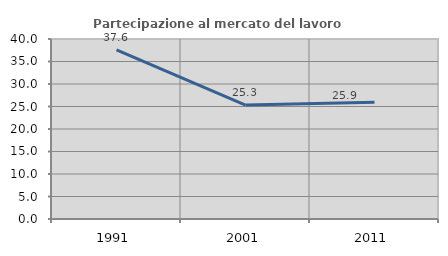
| Category | Partecipazione al mercato del lavoro  femminile |
|---|---|
| 1991.0 | 37.573 |
| 2001.0 | 25.308 |
| 2011.0 | 25.921 |